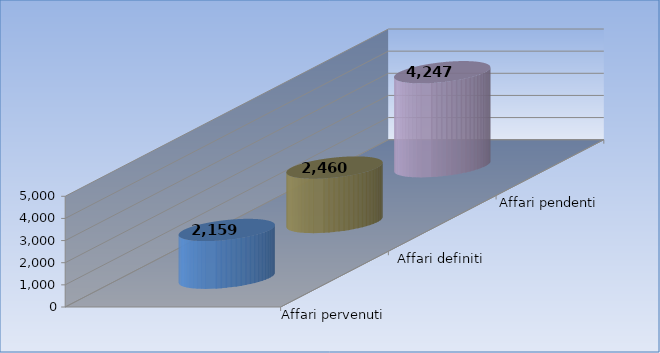
| Category | Affari pervenuti | Affari definiti | Affari pendenti |
|---|---|---|---|
| 0 | 2159 | 2460 | 4247 |